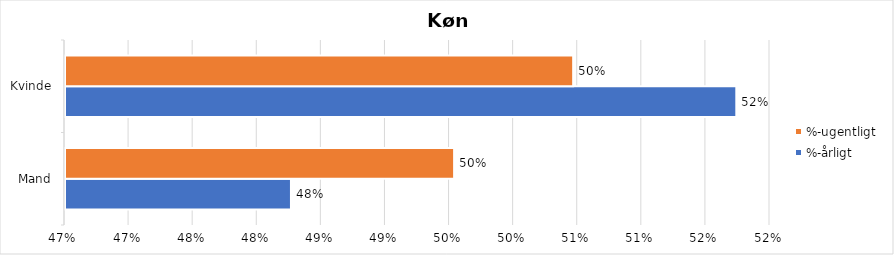
| Category | %-årligt | %-ugentligt |
|---|---|---|
| Mand | 0.483 | 0.495 |
| Kvinde | 0.517 | 0.505 |